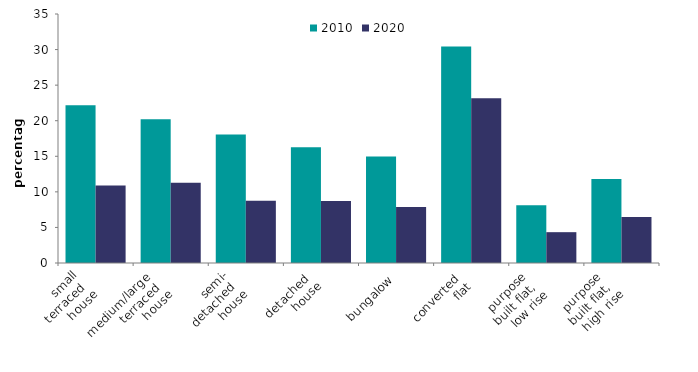
| Category | 2010 | 2020 |
|---|---|---|
| small
 terraced 
house | 22.167 | 10.896 |
| medium/large 
terraced 
house | 20.192 | 11.29 |
| semi-
detached 
house | 18.052 | 8.754 |
| detached 
house | 16.26 | 8.717 |
| bungalow | 14.978 | 7.879 |
| converted 
flat | 30.445 | 23.148 |
| purpose 
built flat, 
low rise | 8.119 | 4.333 |
| purpose 
built flat, 
high rise | 11.792 | 6.457 |